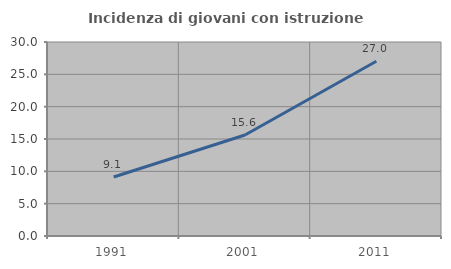
| Category | Incidenza di giovani con istruzione universitaria |
|---|---|
| 1991.0 | 9.123 |
| 2001.0 | 15.621 |
| 2011.0 | 27.018 |